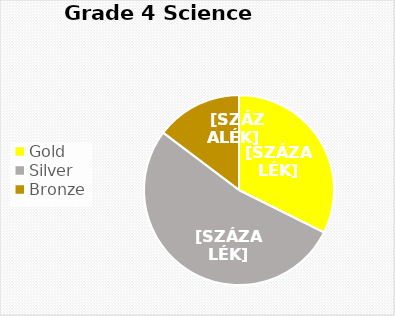
| Category | Series 0 |
|---|---|
| Gold | 11 |
| Silver | 18 |
| Bronze  | 5 |